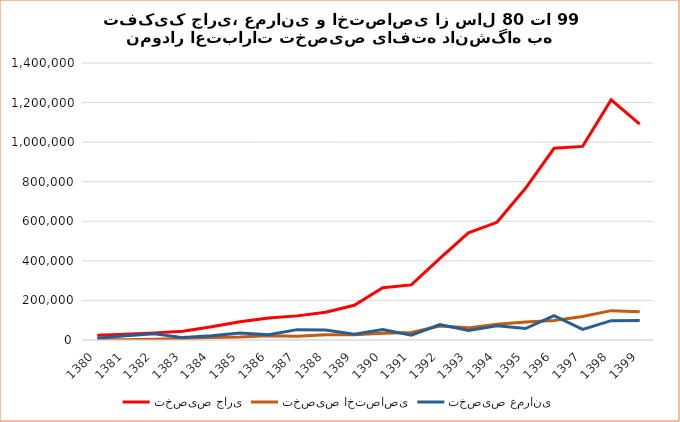
| Category | تخصیص جاری | تخصیص اختصاصی | تخصیص عمرانی |
|---|---|---|---|
| 1380.0 | 24191 | 649 | 8764 |
| 1381.0 | 28668 | 774 | 21910 |
| 1382.0 | 36011 | 3747 | 31110 |
| 1383.0 | 44285 | 7605 | 12066 |
| 1384.0 | 66498 | 12449 | 21500 |
| 1385.0 | 92263 | 15034 | 35080 |
| 1386.0 | 111707 | 21798 | 26716 |
| 1387.0 | 121921 | 19237 | 52394 |
| 1388.0 | 140002 | 26639 | 50476 |
| 1389.0 | 175576 | 26522 | 29633 |
| 1390.0 | 263772 | 34093 | 53353 |
| 1391.0 | 278543 | 37663 | 24454 |
| 1392.0 | 412315 | 70473 | 77829 |
| 1393.0 | 541623 | 61304 | 47555 |
| 1394.0 | 594940 | 79903 | 71358 |
| 1395.0 | 766585 | 90642 | 57776 |
| 1396.0 | 968975 | 98597 | 122640 |
| 1397.0 | 978610 | 119090 | 54003 |
| 1398.0 | 1214102 | 148388 | 97701 |
| 1399.0 | 1090972 | 143012 | 98614 |